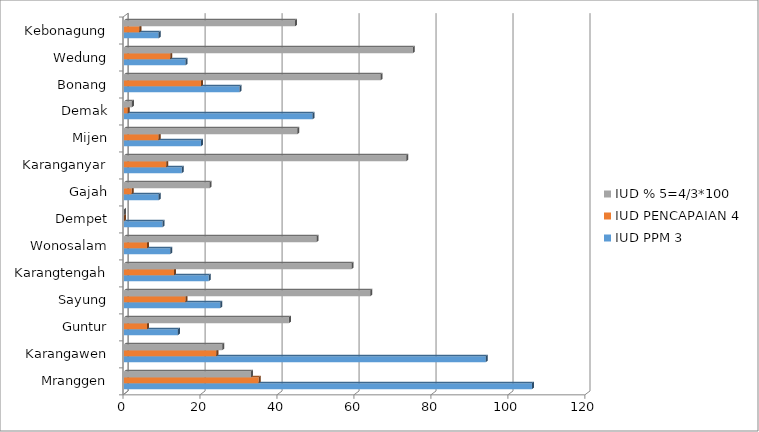
| Category | IUD |
|---|---|
| Mranggen | 33.019 |
| Karangawen | 25.532 |
| Guntur | 42.857 |
| Sayung | 64 |
| Karangtengah | 59.091 |
| Wonosalam | 50 |
| Dempet | 0 |
| Gajah | 22.222 |
| Karanganyar | 73.333 |
| Mijen | 45 |
| Demak | 2.041 |
| Bonang | 66.667 |
| Wedung | 75 |
| Kebonagung | 44.444 |